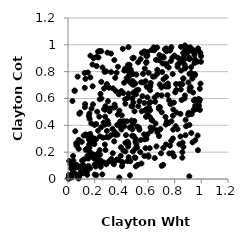
| Category | Series 0 |
|---|---|
| 0.9111496311391557 | 0.784 |
| 0.4300386188368164 | 0.561 |
| 0.11681385047252048 | 0.043 |
| 0.7985105165914542 | 0.92 |
| 0.7381791122740708 | 0.952 |
| 0.2700319630789535 | 0.521 |
| 0.3221652277435572 | 0.326 |
| 0.9387445722189655 | 0.645 |
| 0.1267107533791488 | 0.535 |
| 0.4287532225961268 | 0.594 |
| 0.6065511356872197 | 0.535 |
| 0.8351346793216523 | 0.26 |
| 0.5862582522591401 | 0.866 |
| 0.44732217881595854 | 0.134 |
| 0.4488559231616693 | 0.606 |
| 0.43003705787691354 | 0.205 |
| 0.7948076341762961 | 0.169 |
| 0.19928670790254213 | 0.108 |
| 0.8404600769013258 | 0.867 |
| 0.5054611740116359 | 0.276 |
| 0.3084729279485909 | 0.133 |
| 0.7179206851709915 | 0.905 |
| 0.5133860988383984 | 0.259 |
| 0.2487105842375922 | 0.135 |
| 0.9719962370362792 | 0.874 |
| 0.20007833114893941 | 0.033 |
| 0.5045101652680709 | 0.303 |
| 0.2913176435872602 | 0.358 |
| 0.2808524073220717 | 0.542 |
| 0.482868410909338 | 0.37 |
| 0.6689423891697657 | 0.784 |
| 0.9539236712242827 | 0.546 |
| 0.15937151676626518 | 0.259 |
| 0.9161528200462707 | 0.982 |
| 0.5359604944910391 | 0.367 |
| 0.16169019273082397 | 0.237 |
| 0.9360456858402164 | 0.959 |
| 0.21445749638043748 | 0.911 |
| 0.2226863188615661 | 0.188 |
| 0.7943998662306855 | 0.57 |
| 0.6576356980399197 | 0.976 |
| 0.4674079711340942 | 0.133 |
| 0.7402084669375346 | 0.844 |
| 0.5082239356295544 | 0.094 |
| 0.4420562838119133 | 0.43 |
| 0.27643736715558326 | 0.257 |
| 0.9926049077738904 | 0.941 |
| 0.5907746905910469 | 0.687 |
| 0.7868394595893657 | 0.472 |
| 0.3521998926847201 | 0.537 |
| 0.9303609166335965 | 0.783 |
| 0.23762078883065302 | 0.215 |
| 0.41155091159005164 | 0.123 |
| 0.6976025533912326 | 0.192 |
| 0.07478338903566999 | 0.012 |
| 0.08399607855279058 | 0.085 |
| 0.45103926048094395 | 0.242 |
| 0.4872870481964307 | 0.728 |
| 0.87690141673974 | 0.953 |
| 0.62309148330923 | 0.357 |
| 0.4894274524033153 | 0.716 |
| 0.8214296172695141 | 0.836 |
| 0.24027694764938207 | 0.181 |
| 0.04974177553686305 | 0.659 |
| 0.038212485345732704 | 0.172 |
| 0.8388338152152539 | 0.708 |
| 0.8698020250938937 | 0.888 |
| 0.5761020111148663 | 0.823 |
| 0.5542692115275305 | 0.94 |
| 0.21924962939992823 | 0.501 |
| 0.876567389653877 | 0.622 |
| 0.1176887937832676 | 0.324 |
| 0.752226267749434 | 0.688 |
| 0.07232337755618982 | 0.763 |
| 0.40321776138264415 | 0.475 |
| 0.5049398897146776 | 0.227 |
| 0.4758998143823204 | 0.542 |
| 0.740841750482692 | 0.427 |
| 0.059896144765139034 | 0.036 |
| 0.2401012145934733 | 0.11 |
| 0.026901871690102087 | 0.025 |
| 0.8786929570265387 | 0.933 |
| 0.3763799511567945 | 0.143 |
| 0.19520073622943923 | 0.153 |
| 0.7743492254205568 | 0.284 |
| 0.1631308451751773 | 0.204 |
| 0.9221726681360116 | 0.792 |
| 0.15909288980710912 | 0.167 |
| 0.4537360803392208 | 0.261 |
| 0.5712740880633747 | 0.951 |
| 0.005587227622727847 | 0.007 |
| 0.943444685102764 | 0.586 |
| 0.45970567612820423 | 0.768 |
| 0.7259544833258703 | 0.967 |
| 0.34624599378630816 | 0.281 |
| 0.9509715515077806 | 0.772 |
| 0.3493688597244169 | 0.554 |
| 0.4906103457569296 | 0.57 |
| 0.3730681676680422 | 0.48 |
| 0.48168743190293045 | 0.542 |
| 0.04883140608225112 | 0.097 |
| 0.6175114920485316 | 0.572 |
| 0.008760988786869347 | 0.134 |
| 0.9826457695010916 | 0.574 |
| 0.8123295826385284 | 0.664 |
| 0.8813455821406656 | 0.326 |
| 0.767051686571116 | 0.964 |
| 0.6187659586473282 | 0.383 |
| 0.4812705106600412 | 0.322 |
| 0.025836629642352293 | 0.111 |
| 0.941023196081663 | 0.515 |
| 0.5850044985746435 | 0.463 |
| 0.682341655697244 | 0.886 |
| 0.7825508791672247 | 0.904 |
| 0.9520491313763357 | 0.781 |
| 0.43481581343088727 | 0.327 |
| 0.023551771394068277 | 0.079 |
| 0.5130058153463005 | 0.778 |
| 0.26953783926164593 | 0.123 |
| 0.09730790284939007 | 0.053 |
| 0.663416247100233 | 0.243 |
| 0.22544022324458476 | 0.949 |
| 0.32504495027505376 | 0.15 |
| 0.19969644191872474 | 0.403 |
| 0.6857967307791488 | 0.924 |
| 0.7579993992574036 | 0.587 |
| 0.7288707246093039 | 0.696 |
| 0.9062664315511201 | 0.967 |
| 0.10367045433375191 | 0.277 |
| 0.22564465064415357 | 0.36 |
| 0.13240100288058423 | 0.332 |
| 0.671028275009286 | 0.626 |
| 0.15280136517436163 | 0.152 |
| 0.49265865009890286 | 0.904 |
| 0.39679976875938894 | 0.236 |
| 0.42828779709065523 | 0.822 |
| 0.4213157016411308 | 0.392 |
| 0.7680185431607683 | 0.558 |
| 0.9893255299276582 | 0.515 |
| 0.7900587321114094 | 0.518 |
| 0.7756833519142676 | 0.43 |
| 0.8458151306899847 | 0.667 |
| 0.3854031375389695 | 0.509 |
| 0.49882682942240414 | 0.505 |
| 0.6706159708335547 | 0.347 |
| 0.3914169937285117 | 0.43 |
| 0.9939247139479255 | 0.711 |
| 0.9340045036081808 | 0.273 |
| 0.07986537616585188 | 0.086 |
| 0.05449427400802917 | 0.356 |
| 0.39544665280635954 | 0.383 |
| 0.08032858588812802 | 0.225 |
| 0.034017297367350666 | 0.04 |
| 0.6161196408934705 | 0.46 |
| 0.1757225119408164 | 0.277 |
| 0.5257227155728047 | 0.87 |
| 0.703084193369922 | 0.497 |
| 0.07919287777658164 | 0.004 |
| 0.8744259201408906 | 0.601 |
| 0.8248153629797152 | 0.904 |
| 0.01917307968669447 | 0.011 |
| 0.6455770824102766 | 0.959 |
| 0.2753713638042745 | 0.405 |
| 0.5052301861827468 | 0.711 |
| 0.7837023749152509 | 0.193 |
| 0.018765271043172115 | 0.111 |
| 0.17653834796077228 | 0.525 |
| 0.7851836252765338 | 0.783 |
| 0.06438279124625247 | 0.106 |
| 0.8775693251550845 | 0.824 |
| 0.4494715765987105 | 0.807 |
| 0.621012419698169 | 0.716 |
| 0.859439359352633 | 0.271 |
| 0.33911390747775305 | 0.119 |
| 0.3588237063014709 | 0.656 |
| 0.8100756523471898 | 0.708 |
| 0.3640979837635689 | 0.14 |
| 0.24929612866749917 | 0.953 |
| 0.9898989873816444 | 0.591 |
| 0.41815318400173646 | 0.431 |
| 0.09179441449348216 | 0.495 |
| 0.8862998370651437 | 0.939 |
| 0.006274618011588827 | 0.03 |
| 0.9003076634861106 | 0.946 |
| 0.4507449248947203 | 0.851 |
| 0.6411268964553156 | 0.379 |
| 0.2224737885086305 | 0.161 |
| 0.7866470594573786 | 0.302 |
| 0.8487515444871679 | 0.808 |
| 0.5271780323742159 | 0.665 |
| 0.5052193867373331 | 0.157 |
| 0.06397933855268545 | 0.248 |
| 0.16632330492320033 | 0.337 |
| 0.08452118674544683 | 0.021 |
| 0.26226640652464206 | 0.308 |
| 0.0847946098456753 | 0.486 |
| 0.15685260605337195 | 0.294 |
| 0.22864330152590254 | 0.906 |
| 0.5447199334130336 | 0.894 |
| 0.8721031026799437 | 0.981 |
| 0.3163480790695066 | 0.526 |
| 0.18100616759296553 | 0.178 |
| 0.8813875304684765 | 0.83 |
| 0.59560499671388 | 0.332 |
| 0.21180969954778517 | 0.029 |
| 0.11378361409356955 | 0.104 |
| 0.48763989077746944 | 0.783 |
| 0.04029030924734762 | 0.137 |
| 0.9483932315101667 | 0.925 |
| 0.2383875103758074 | 0.595 |
| 0.0177769035114162 | 0.021 |
| 0.24978517041126838 | 0.724 |
| 0.9734767486221393 | 0.521 |
| 0.5742748563771243 | 0.296 |
| 0.6493970929622763 | 0.607 |
| 0.8646022898844322 | 0.748 |
| 0.14377879817939881 | 0.031 |
| 0.6052241117624018 | 0.791 |
| 0.30367961988089104 | 0.311 |
| 0.7597245571204744 | 0.19 |
| 0.02880479635935147 | 0.078 |
| 0.9274333788455694 | 0.483 |
| 0.49748544975427494 | 0.432 |
| 0.9104304492959125 | 0.403 |
| 0.12480412435384455 | 0.79 |
| 0.884345972348518 | 0.983 |
| 0.7888246886596952 | 0.368 |
| 0.05010787103246642 | 0.656 |
| 0.16764279642788887 | 0.757 |
| 0.6820139419356843 | 0.32 |
| 0.2919633290471828 | 0.707 |
| 0.09026721276470592 | 0.032 |
| 0.1623759204625662 | 0.448 |
| 0.6696282502788881 | 0.814 |
| 0.1872550322702444 | 0.557 |
| 0.7313012747173697 | 0.462 |
| 0.10581246622910304 | 0.137 |
| 0.7028842753028343 | 0.098 |
| 0.8755665192235897 | 0.851 |
| 0.5953209145495835 | 0.946 |
| 0.5813713028113396 | 0.23 |
| 0.9124424929485175 | 0.659 |
| 0.2455905148012621 | 0.091 |
| 0.12857854477047578 | 0.559 |
| 0.16469421912044294 | 0.194 |
| 0.34413890772122013 | 0.11 |
| 0.13245981401363427 | 0.218 |
| 0.16893580289818075 | 0.294 |
| 0.3847318346268138 | 0.011 |
| 0.005399768778397544 | 0.01 |
| 0.5952114951543013 | 0.918 |
| 0.20963372149151546 | 0.295 |
| 0.6692693612619083 | 0.362 |
| 0.15602012778356075 | 0.469 |
| 0.4701671348628871 | 0.816 |
| 0.19598799089965352 | 0.303 |
| 0.7647363527612803 | 0.249 |
| 0.21465359330388317 | 0.841 |
| 0.8445243386020784 | 0.708 |
| 0.6540157586665576 | 0.575 |
| 0.5629011547370278 | 0.783 |
| 0.6687288286755981 | 0.98 |
| 0.5101854614631756 | 0.631 |
| 0.9722113911167326 | 0.324 |
| 0.12046569035783182 | 0.147 |
| 0.4544942237458471 | 0.636 |
| 0.8435110820322342 | 0.486 |
| 0.8853584648805858 | 0.393 |
| 0.6825224080144272 | 0.536 |
| 0.8587929087278529 | 0.879 |
| 0.5579309056935479 | 0.618 |
| 0.45843683942843644 | 0.774 |
| 0.4548262540265198 | 0.162 |
| 0.4225252467339125 | 0.808 |
| 0.7749881198674418 | 0.983 |
| 0.24793985172870386 | 0.385 |
| 0.8522300430809937 | 0.589 |
| 0.9481681768329914 | 0.864 |
| 0.23520353394011623 | 0.954 |
| 0.4655884353475929 | 0.786 |
| 0.28775112618688087 | 0.11 |
| 0.15394479250881912 | 0.215 |
| 0.4698374076950021 | 0.806 |
| 0.8656013902200975 | 0.749 |
| 0.48608809437462175 | 0.41 |
| 0.27813953340355224 | 0.465 |
| 0.6564192551374263 | 0.415 |
| 0.9211280781796216 | 0.685 |
| 0.7351113801966238 | 0.257 |
| 0.18565973627333884 | 0.183 |
| 0.03576656743174452 | 0.045 |
| 0.7140524831238316 | 0.106 |
| 0.7123563891438197 | 0.913 |
| 0.3915835078948125 | 0.418 |
| 0.572785436185337 | 0.171 |
| 0.4991576149935779 | 0.629 |
| 0.41501338504348406 | 0.64 |
| 0.2573104878836541 | 0.034 |
| 0.975497208738205 | 0.973 |
| 0.07505048824209203 | 0.096 |
| 0.5724429234536887 | 0.567 |
| 0.7357865615727973 | 0.859 |
| 0.9246928957282298 | 0.343 |
| 0.25076474672907956 | 0.6 |
| 0.032419043037878584 | 0.035 |
| 0.48187682899384565 | 0.6 |
| 0.6598951664406528 | 0.888 |
| 0.48445849479543235 | 0.9 |
| 0.5893083750348156 | 0.871 |
| 0.3474435439066111 | 0.886 |
| 0.5532272836003694 | 0.505 |
| 0.5316097543098819 | 0.384 |
| 0.8039051164061431 | 0.646 |
| 0.3689651995443692 | 0.403 |
| 0.9101439839449574 | 0.02 |
| 0.4648392637384652 | 0.028 |
| 0.9044739395691748 | 0.493 |
| 0.270061186596074 | 0.674 |
| 0.8229408695928077 | 0.854 |
| 0.15349554410771482 | 0.307 |
| 0.14390503567648563 | 0.056 |
| 0.5488966629912435 | 0.721 |
| 0.24383046416597406 | 0.635 |
| 0.6040563112554095 | 0.166 |
| 0.6508364079686448 | 0.156 |
| 0.43982219121103644 | 0.752 |
| 0.04966310262180306 | 0.08 |
| 0.27410290187233943 | 0.799 |
| 0.5957477171589858 | 0.608 |
| 0.7446870081474366 | 0.696 |
| 0.9983281113827457 | 0.915 |
| 0.3222462187789793 | 0.935 |
| 0.0033294293011412778 | 0.002 |
| 0.714910455477086 | 0.232 |
| 0.1504093353605 | 0.328 |
| 0.355367555169529 | 0.329 |
| 0.13064787056418273 | 0.747 |
| 0.586735983353006 | 0.918 |
| 0.9113158379588734 | 0.892 |
| 0.26709244730732074 | 0.421 |
| 0.18480579621523677 | 0.691 |
| 0.44756895475378894 | 0.278 |
| 0.22630834394715654 | 0.133 |
| 0.4786280226514887 | 0.729 |
| 0.018032482971785987 | 0.016 |
| 0.33787486038635967 | 0.676 |
| 0.7060697262550751 | 0.797 |
| 0.16037502131211015 | 0.488 |
| 0.1923264879729971 | 0.9 |
| 0.20038170153305127 | 0.152 |
| 0.4867522747781392 | 0.205 |
| 0.4627241420024789 | 0.384 |
| 0.6306259271255792 | 0.438 |
| 0.1949009456227638 | 0.291 |
| 0.8821936961119609 | 0.44 |
| 0.6286506862018308 | 0.438 |
| 0.16090512224983794 | 0.253 |
| 0.286681341287852 | 0.802 |
| 0.6929347292016164 | 0.371 |
| 0.5180430629211012 | 0.234 |
| 0.9011662287840501 | 0.479 |
| 0.6426821930166791 | 0.981 |
| 0.12599641981854187 | 0.68 |
| 0.15379470399089712 | 0.097 |
| 0.5131117712463316 | 0.661 |
| 0.37465390498260465 | 0.837 |
| 0.14054283456926503 | 0.224 |
| 0.3998931467720705 | 0.656 |
| 0.1747782563213394 | 0.272 |
| 0.5977507389358183 | 0.479 |
| 0.734986426945574 | 0.76 |
| 0.876745084083697 | 0.996 |
| 0.4007449070588922 | 0.369 |
| 0.3716029877899251 | 0.331 |
| 0.979700926223514 | 0.597 |
| 0.8573316412036209 | 0.2 |
| 0.5370454399235391 | 0.58 |
| 0.45394097062533695 | 0.983 |
| 0.4738967054804393 | 0.713 |
| 0.23859358491156196 | 0.317 |
| 0.8639068707135346 | 0.939 |
| 0.8138201034404088 | 0.496 |
| 0.8436807504478155 | 0.316 |
| 0.3086932218356539 | 0.681 |
| 0.6131225369540642 | 0.23 |
| 0.7023348105295489 | 0.623 |
| 0.912454120501298 | 0.678 |
| 0.8570375728392539 | 0.158 |
| 0.8758664059772147 | 0.932 |
| 0.9774553042929551 | 0.956 |
| 0.7495743740632987 | 0.711 |
| 0.865034942735361 | 0.239 |
| 0.9537264373692955 | 0.289 |
| 0.7649956621461231 | 0.957 |
| 0.4916979604443851 | 0.645 |
| 0.6811073396132334 | 0.523 |
| 0.7356691292229984 | 0.689 |
| 0.03608270852264394 | 0.046 |
| 0.4048173906136502 | 0.127 |
| 0.47625937239212457 | 0.436 |
| 0.8578062022665671 | 0.706 |
| 0.8641530248449524 | 0.905 |
| 0.35236441754230796 | 0.349 |
| 0.6268535857692868 | 0.962 |
| 0.581175300786519 | 0.511 |
| 0.9448143718635422 | 0.513 |
| 0.2108953290103585 | 0.41 |
| 0.565785592942319 | 0.719 |
| 0.5849654443828796 | 0.519 |
| 0.4615039704124394 | 0.851 |
| 0.36677247139202795 | 0.145 |
| 0.32377214863305087 | 0.797 |
| 0.08092078372941008 | 0.292 |
| 0.5883249531337096 | 0.298 |
| 0.6895874910183369 | 0.534 |
| 0.5822880898928268 | 0.729 |
| 0.7529530551330442 | 0.416 |
| 0.9819272418329588 | 0.547 |
| 0.7712583499485448 | 0.879 |
| 0.4112804175875829 | 0.97 |
| 0.6507112167378887 | 0.764 |
| 0.02773641730181459 | 0.012 |
| 0.4889993871082694 | 0.702 |
| 0.616515796493571 | 0.513 |
| 0.2816249259111997 | 0.217 |
| 0.07026422702909252 | 0.259 |
| 0.16540839098030533 | 0.08 |
| 0.27766720511748205 | 0.516 |
| 0.9084023697782886 | 0.904 |
| 0.36425357014219817 | 0.792 |
| 0.9887054825920689 | 0.672 |
| 0.19769424575131037 | 0.26 |
| 0.3539325358590926 | 0.754 |
| 0.49282572233518024 | 0.32 |
| 0.7462167347315874 | 0.625 |
| 0.8082859310869005 | 0.393 |
| 0.14881359960106247 | 0.794 |
| 0.571274038467833 | 0.333 |
| 0.3335441129398718 | 0.373 |
| 0.3032125015384867 | 0.41 |
| 0.9974006501978054 | 0.874 |
| 0.18363430742967424 | 0.853 |
| 0.6176356915933481 | 0.693 |
| 0.2999215312792809 | 0.579 |
| 0.10887054275662905 | 0.101 |
| 0.38165933351763137 | 0.631 |
| 0.7092600676442516 | 0.861 |
| 0.430110738788333 | 0.27 |
| 0.29011660446067017 | 0.313 |
| 0.1260001690078417 | 0.077 |
| 0.14687657300835286 | 0.174 |
| 0.6109946080754031 | 0.567 |
| 0.009034837817281044 | 0.016 |
| 0.34373836311232236 | 0.532 |
| 0.9502455906374477 | 0.893 |
| 0.1691984412351196 | 0.323 |
| 0.6365603997770843 | 0.763 |
| 0.5269345380389276 | 0.542 |
| 0.3118973734018932 | 0.504 |
| 0.45232580642432385 | 0.732 |
| 0.7356727406360125 | 0.974 |
| 0.5239049143967517 | 0.106 |
| 0.542178785271175 | 0.2 |
| 0.5452089677619399 | 0.29 |
| 0.9746741142741795 | 0.215 |
| 0.500437027124027 | 0.16 |
| 0.9432825372587047 | 0.944 |
| 0.6158344282874106 | 0.661 |
| 0.6877340967406099 | 0.705 |
| 0.4162611949304369 | 0.211 |
| 0.3362864449615718 | 0.192 |
| 0.821634621671969 | 0.371 |
| 0.9525099290649873 | 0.593 |
| 0.8475672588649977 | 0.985 |
| 0.4209476841480431 | 0.717 |
| 0.9322516620923039 | 0.748 |
| 0.18954060682584475 | 0.181 |
| 0.7011662063030352 | 0.682 |
| 0.29689272868560607 | 0.433 |
| 0.755176393331784 | 0.831 |
| 0.20757743310728957 | 0.093 |
| 0.39520521439462836 | 0.172 |
| 0.17468199107881754 | 0.415 |
| 0.5507354822957218 | 0.115 |
| 0.7159330929798108 | 0.743 |
| 0.29037195378984204 | 0.698 |
| 0.9027061506913044 | 0.719 |
| 0.9587436592719039 | 0.586 |
| 0.5193878205955742 | 0.391 |
| 0.033479371856075545 | 0.581 |
| 0.25877538031532676 | 0.831 |
| 0.23465738655797183 | 0.465 |
| 0.9237049672002811 | 0.834 |
| 0.6020632505800014 | 0.176 |
| 0.06118012542209493 | 0.267 |
| 0.16812172353839547 | 0.919 |
| 0.7332315030795299 | 0.406 |
| 0.29604081934181636 | 0.942 |
| 0.9306601800497131 | 0.968 |
| 0.4047633806187904 | 0.096 |